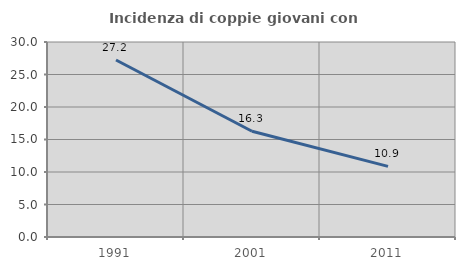
| Category | Incidenza di coppie giovani con figli |
|---|---|
| 1991.0 | 27.229 |
| 2001.0 | 16.262 |
| 2011.0 | 10.87 |